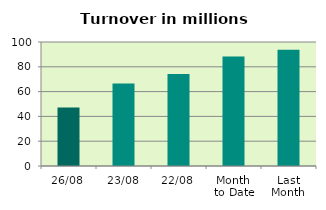
| Category | Series 0 |
|---|---|
| 26/08 | 47.163 |
| 23/08 | 66.581 |
| 22/08 | 74.135 |
| Month 
to Date | 88.329 |
| Last
Month | 93.691 |